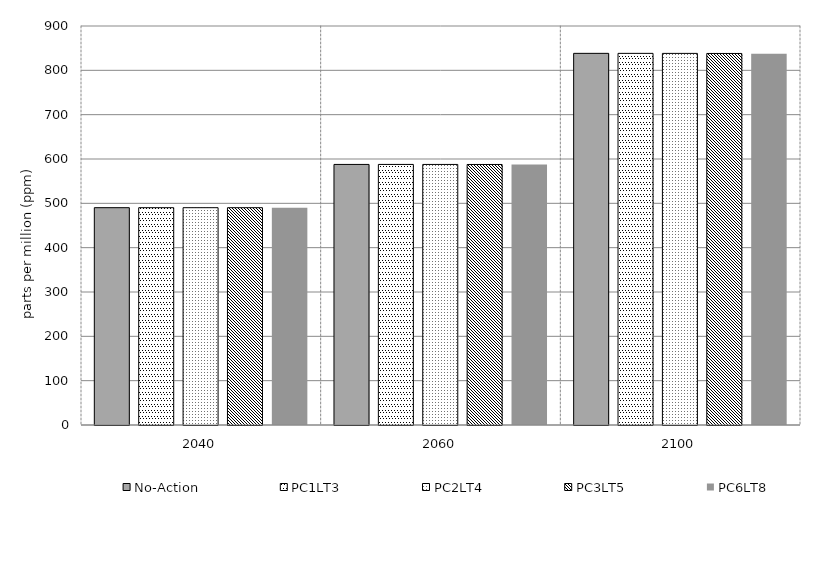
| Category | No-Action | PC1LT3 | PC2LT4 | PC3LT5 | PC6LT8 | Alt 5 | Alt 6 | Alt 7 | Alt 8 | Alt 10 |
|---|---|---|---|---|---|---|---|---|---|---|
| 2040.0 | 490.191 | 490.179 | 490.172 | 490.155 | 490.097 |  |  |  |  |  |
| 2060.0 | 587.756 | 587.738 | 587.708 | 587.642 | 587.416 |  |  |  |  |  |
| 2100.0 | 838.312 | 838.286 | 838.209 | 838.042 | 837.48 |  |  |  |  |  |